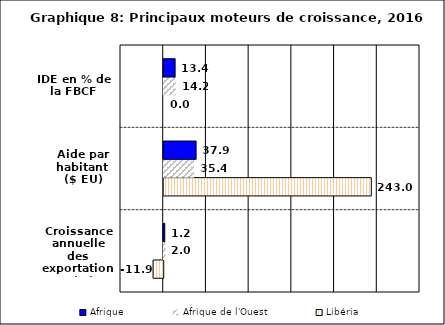
| Category | Libéria | Afrique de l'Ouest | Afrique |
|---|---|---|---|
| Croissance annuelle des exportations (%) | -11.9 | 1.951 | 1.219 |
| Aide par habitant ($ EU) | 243.021 | 35.416 | 37.904 |
| IDE en % de la FBCF | 0 | 14.214 | 13.354 |